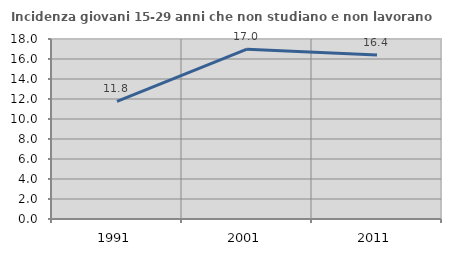
| Category | Incidenza giovani 15-29 anni che non studiano e non lavorano  |
|---|---|
| 1991.0 | 11.753 |
| 2001.0 | 16.981 |
| 2011.0 | 16.393 |